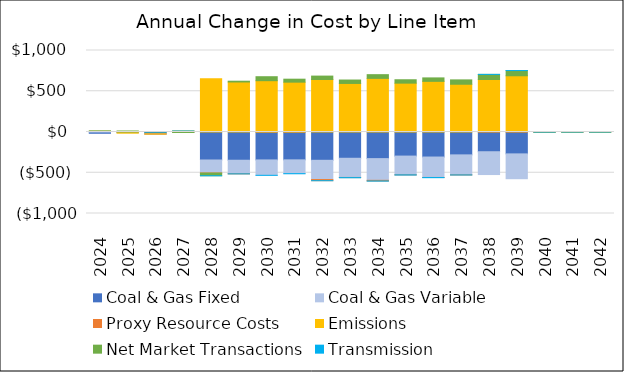
| Category | Coal & Gas Fixed | Coal & Gas Variable | Proxy Resource Costs | Emissions | Net Market Transactions | Transmission |
|---|---|---|---|---|---|---|
| 2024.0 | -15.771 | 7.534 | 0.323 | 0.937 | 4.701 | 0 |
| 2025.0 | 0.911 | -8.323 | 0.051 | -6.027 | 11.414 | 0 |
| 2026.0 | -22.994 | -1.241 | -0.045 | -0.654 | 0.579 | 0 |
| 2027.0 | 8.278 | 1.72 | -0.016 | 2.267 | -6.155 | 0 |
| 2028.0 | -343.465 | -159.576 | -1.116 | 653.346 | -32.755 | -0.002 |
| 2029.0 | -346.516 | -165.478 | -1.503 | 613.626 | 9.678 | -0.029 |
| 2030.0 | -342.621 | -188.789 | 0.26 | 629.396 | 48.736 | -0.037 |
| 2031.0 | -341.848 | -169.235 | 0.139 | 611.469 | 36.424 | -0.653 |
| 2032.0 | -347.099 | -236.308 | -13.824 | 644.236 | 41.713 | -0.391 |
| 2033.0 | -322.31 | -235.366 | -1.893 | 595.809 | 41.954 | -1.722 |
| 2034.0 | -326.566 | -266.55 | -7.678 | 657.912 | 45.659 | -1.762 |
| 2035.0 | -295.37 | -230.345 | -0.139 | 599.382 | 41.773 | -1.802 |
| 2036.0 | -307.195 | -250.616 | -0.84 | 621.409 | 42.397 | -1.843 |
| 2037.0 | -280.65 | -245.351 | -0.877 | 585.969 | 53.521 | -0.116 |
| 2038.0 | -242.123 | -279.893 | 3.544 | 640.875 | 62.402 | 0.02 |
| 2039.0 | -268.433 | -304.625 | 1.629 | 688.332 | 64.221 | 0.02 |
| 2040.0 | -0.227 | 0.113 | 0.005 | 0.037 | 0.016 | -0.131 |
| 2041.0 | 0 | 0.08 | -0.001 | 0.011 | -0.042 | 0.034 |
| 2042.0 | 0 | 0.02 | -0.001 | 0.048 | 0.033 | 0.035 |